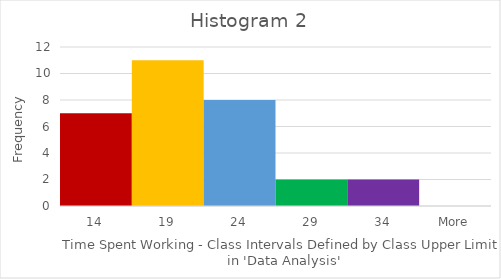
| Category | Frequency |
|---|---|
| 14 | 7 |
| 19 | 11 |
| 24 | 8 |
| 29 | 2 |
| 34 | 2 |
| More | 0 |